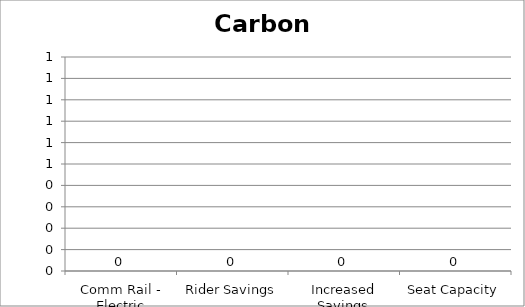
| Category | Carbon Monoxide |
|---|---|
| Comm Rail - Electric | 0 |
| Rider Savings | 0 |
| Increased Savings | 0 |
| Seat Capacity | 0 |